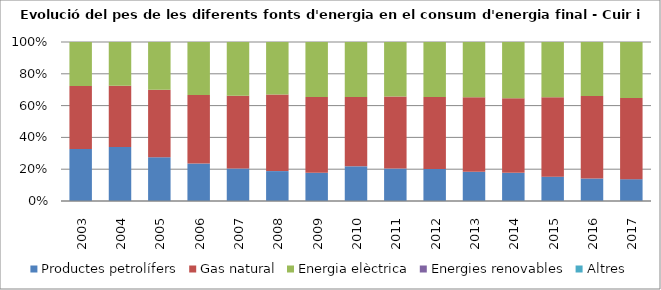
| Category | Productes petrolífers | Gas natural | Energia elèctrica | Energies renovables | Altres |
|---|---|---|---|---|---|
| 2003.0 | 8.5 | 10.3 | 7.2 | 0 | 0 |
| 2004.0 | 8.4 | 9.5 | 6.8 | 0 | 0 |
| 2005.0 | 5.6 | 8.6 | 6.1 | 0 | 0 |
| 2006.0 | 4.1 | 7.5 | 5.8 | 0 | 0 |
| 2007.0 | 2.9 | 6.5 | 4.8 | 0 | 0 |
| 2008.0 | 2.5 | 6.4 | 4.4 | 0 | 0 |
| 2009.0 | 1.9 | 5.1 | 3.7 | 0 | 0 |
| 2010.0 | 2.4 | 4.8 | 3.8 | 0 | 0 |
| 2011.0 | 2.2 | 4.9 | 3.7 | 0 | 0 |
| 2012.0 | 2.1 | 4.7 | 3.6 | 0 | 0 |
| 2013.0 | 1.8 | 4.6 | 3.4 | 0 | 0 |
| 2014.0 | 1.7 | 4.5 | 3.4 | 0 | 0 |
| 2015.0 | 1.5 | 4.9 | 3.4 | 0 | 0 |
| 2016.0 | 1.5 | 5.5 | 3.6 | 0 | 0 |
| 2017.0 | 1.4 | 5.2 | 3.6 | 0 | 0 |